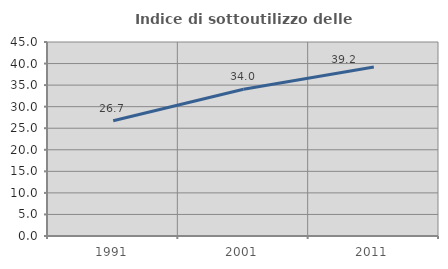
| Category | Indice di sottoutilizzo delle abitazioni  |
|---|---|
| 1991.0 | 26.716 |
| 2001.0 | 34.048 |
| 2011.0 | 39.222 |